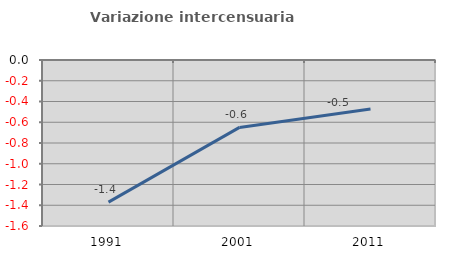
| Category | Variazione intercensuaria annua |
|---|---|
| 1991.0 | -1.37 |
| 2001.0 | -0.65 |
| 2011.0 | -0.473 |